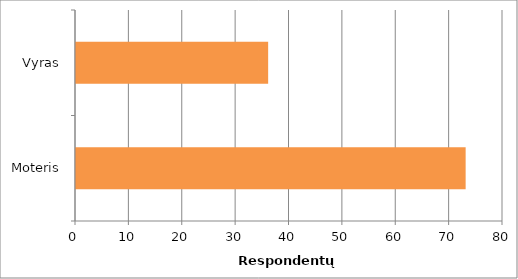
| Category | Series 0 |
|---|---|
| Moteris | 73 |
| Vyras | 36 |